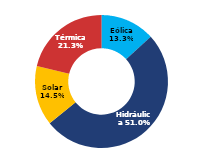
| Category | Sur |
|---|---|
| Eólica | 78.052 |
| Hidráulica | 299.626 |
| Solar | 85.344 |
| Térmica | 125.043 |